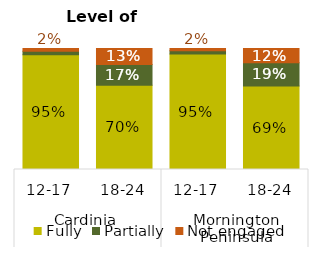
| Category | Fully | Partially | Not engaged |
|---|---|---|---|
| 0 | 0.949 | 0.029 | 0.022 |
| 1 | 0.697 | 0.171 | 0.132 |
| 2 | 0.954 | 0.028 | 0.019 |
| 3 | 0.689 | 0.192 | 0.118 |